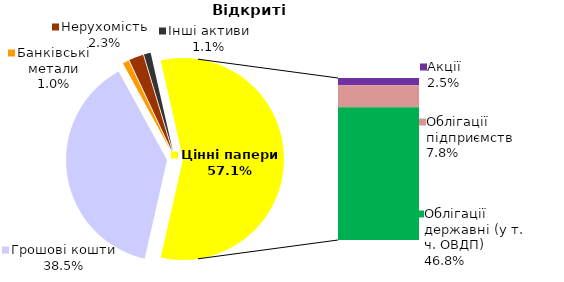
| Category | Відкриті |
|---|---|
| Грошові кошти | 352.551 |
| Банківські метали | 9.132 |
| Нерухомість | 21.33 |
| Інші активи | 10.012 |
| Акції | 23.026 |
| Облігації підприємств | 71.259 |
| Муніципальні облігації | 0 |
| Облігації державні (у т. ч. ОВДП) | 428.966 |